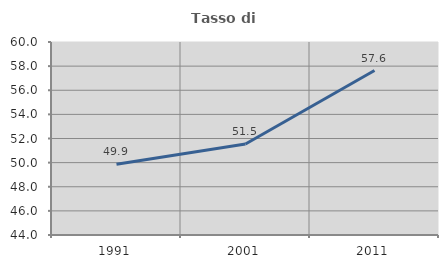
| Category | Tasso di occupazione   |
|---|---|
| 1991.0 | 49.866 |
| 2001.0 | 51.546 |
| 2011.0 | 57.632 |